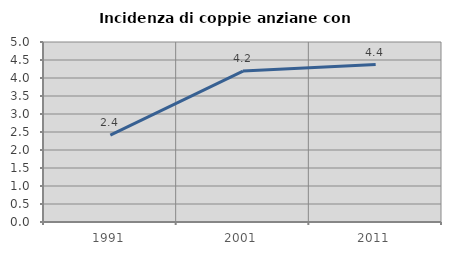
| Category | Incidenza di coppie anziane con figli |
|---|---|
| 1991.0 | 2.416 |
| 2001.0 | 4.193 |
| 2011.0 | 4.373 |